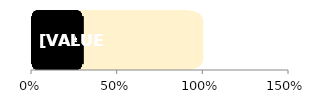
| Category | Total | Female |
|---|---|---|
| 0 | 1 | 0.303 |